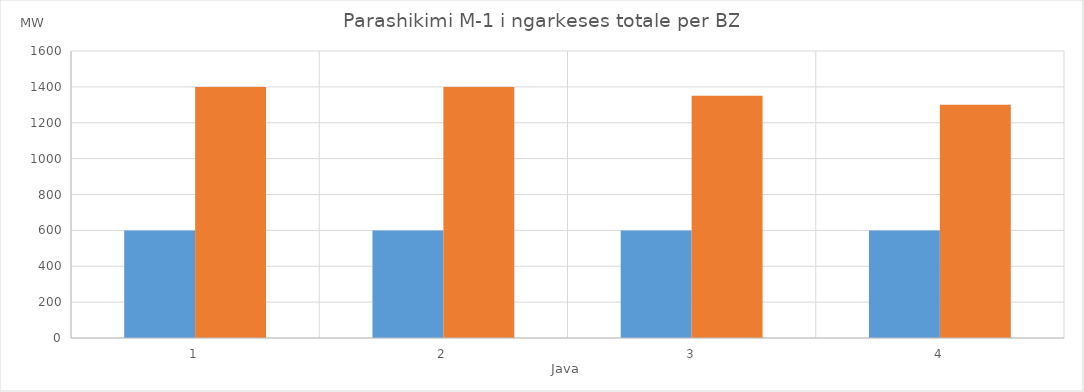
| Category | Min (MW) | Max (MW) |
|---|---|---|
| 0 | 600 | 1400 |
| 1 | 600 | 1400 |
| 2 | 600 | 1350 |
| 3 | 600 | 1300 |